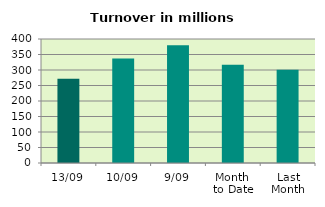
| Category | Series 0 |
|---|---|
| 13/09 | 271.925 |
| 10/09 | 336.901 |
| 9/09 | 379.521 |
| Month 
to Date | 317.035 |
| Last
Month | 300.77 |